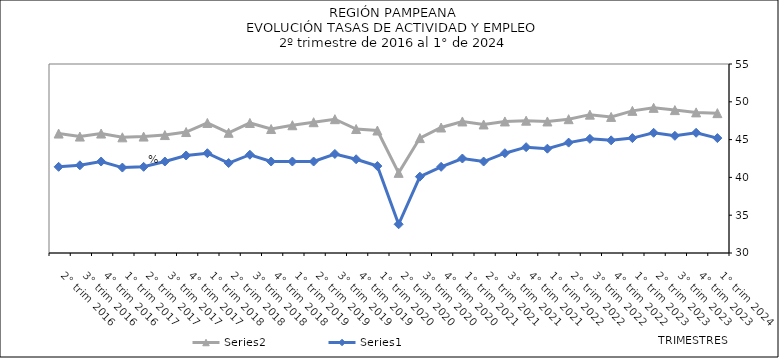
| Category | Series 2 | Series 0 |
|---|---|---|
| 1° trim 2024 | 48.5 | 45.2 |
| 4° trim 2023 | 48.6 | 45.9 |
| 3° trim 2023 | 48.9 | 45.5 |
| 2° trim 2023 | 49.2 | 45.9 |
| 1° trim 2023 | 48.8 | 45.2 |
| 4° trim 2022 | 48 | 44.9 |
| 3° trim 2022 | 48.3 | 45.1 |
| 2° trim 2022 | 47.7 | 44.6 |
| 1° trim 2022 | 47.4 | 43.8 |
| 4° trim 2021 | 47.5 | 44 |
| 3° trim 2021 | 47.4 | 43.2 |
| 2° trim 2021 | 47 | 42.1 |
| 1° trim 2021 | 47.4 | 42.5 |
| 4° trim 2020 | 46.6 | 41.4 |
| 3° trim 2020 | 45.2 | 40.1 |
| 2° trim 2020 | 40.6 | 33.8 |
| 1° trim 2020 | 46.2 | 41.5 |
| 4° trim 2019 | 46.4 | 42.4 |
| 3° trim 2019 | 47.7 | 43.1 |
| 2° trim 2019 | 47.3 | 42.1 |
| 1° trim 2019 | 46.9 | 42.1 |
| 4° trim 2018 | 46.4 | 42.1 |
| 3° trim 2018 | 47.2 | 43 |
| 2° trim 2018 | 45.9 | 41.9 |
| 1° trim 2018 | 47.2 | 43.2 |
| 4° trim 2017 | 46 | 42.9 |
| 3° trim 2017 | 45.6 | 42.1 |
| 2° trim 2017 | 45.4 | 41.4 |
| 1° trim 2017 | 45.3 | 41.3 |
| 4° trim 2016 | 45.8 | 42.1 |
| 3° trim 2016 | 45.4 | 41.6 |
| 2° trim 2016 | 45.8 | 41.4 |